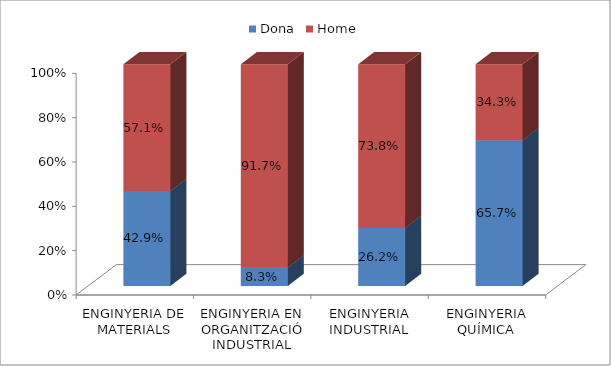
| Category | Dona | Home |
|---|---|---|
| ENGINYERIA DE MATERIALS | 0.429 | 0.571 |
| ENGINYERIA EN ORGANITZACIÓ INDUSTRIAL | 0.083 | 0.917 |
| ENGINYERIA INDUSTRIAL | 0.262 | 0.738 |
| ENGINYERIA QUÍMICA | 0.657 | 0.343 |